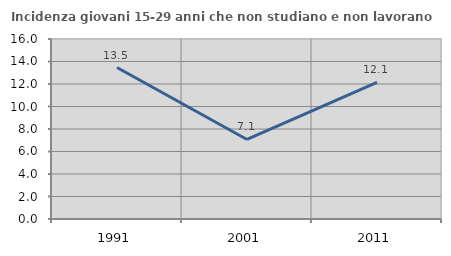
| Category | Incidenza giovani 15-29 anni che non studiano e non lavorano  |
|---|---|
| 1991.0 | 13.464 |
| 2001.0 | 7.07 |
| 2011.0 | 12.141 |